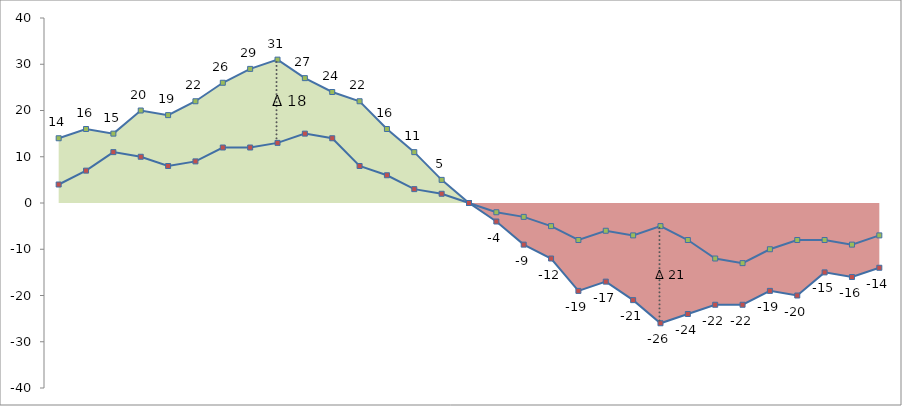
| Category | Line 1 | Line 2 |
|---|---|---|
| 0 | 14 | 4 |
| 1 | 16 | 7 |
| 2 | 15 | 11 |
| 3 | 20 | 10 |
| 4 | 19 | 8 |
| 5 | 22 | 9 |
| 6 | 26 | 12 |
| 7 | 29 | 12 |
| 8 | 31 | 13 |
| 9 | 27 | 15 |
| 10 | 24 | 14 |
| 11 | 22 | 8 |
| 12 | 16 | 6 |
| 13 | 11 | 3 |
| 14 | 5 | 2 |
| 15 | 0 | 0 |
| 16 | -2 | -4 |
| 17 | -3 | -9 |
| 18 | -5 | -12 |
| 19 | -8 | -19 |
| 20 | -6 | -17 |
| 21 | -7 | -21 |
| 22 | -5 | -26 |
| 23 | -8 | -24 |
| 24 | -12 | -22 |
| 25 | -13 | -22 |
| 26 | -10 | -19 |
| 27 | -8 | -20 |
| 28 | -8 | -15 |
| 29 | -9 | -16 |
| 30 | -7 | -14 |